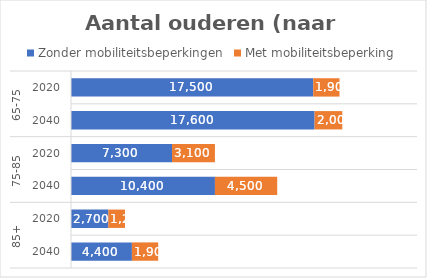
| Category | Zonder mobiliteitsbeperkingen | Met mobiliteitsbeperking |
|---|---|---|
| 0 | 4400 | 1900 |
| 1 | 2700 | 1200 |
| 2 | 10400 | 4500 |
| 3 | 7300 | 3100 |
| 4 | 17600 | 2000 |
| 5 | 17500 | 1900 |